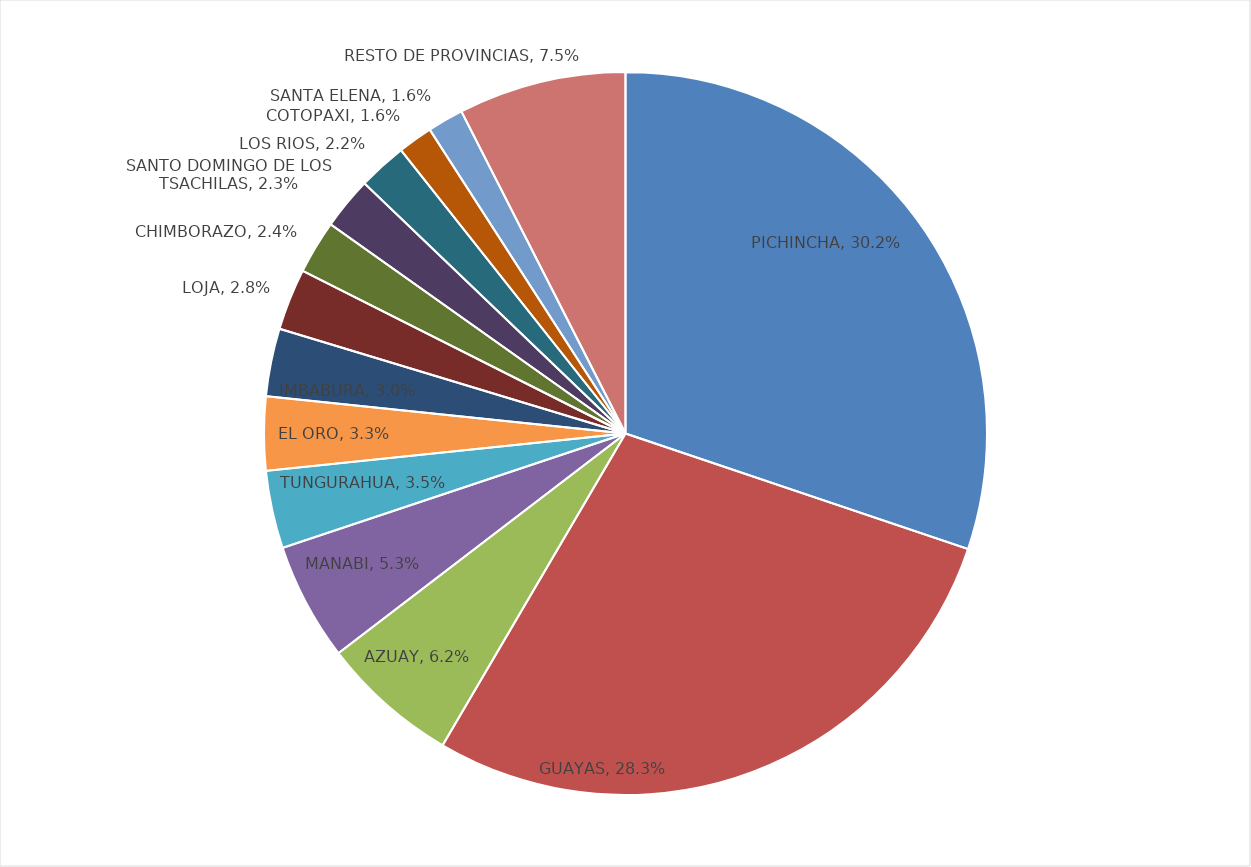
| Category | PORCENTAJE DE CUENTAS DE INTERNET FIJO |
|---|---|
| PICHINCHA | 0.302 |
| GUAYAS | 0.283 |
| AZUAY | 0.062 |
| MANABI | 0.053 |
| TUNGURAHUA | 0.035 |
| EL ORO | 0.033 |
| IMBABURA | 0.03 |
| LOJA | 0.028 |
| CHIMBORAZO | 0.024 |
| SANTO DOMINGO DE LOS TSACHILAS | 0.023 |
| LOS RIOS | 0.022 |
| COTOPAXI | 0.016 |
| SANTA ELENA | 0.016 |
| RESTO DE PROVINCIAS | 0.075 |